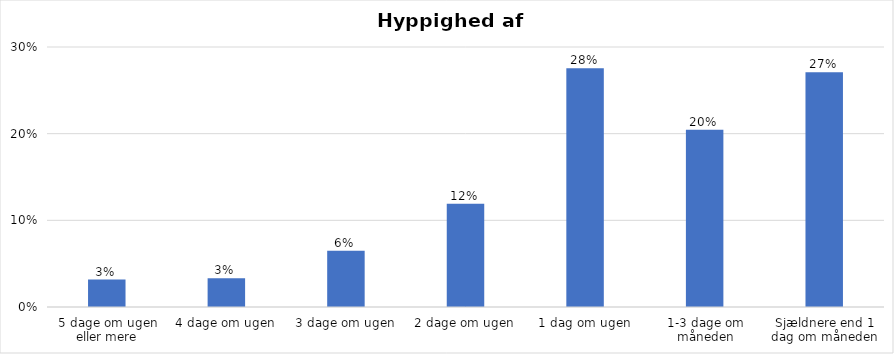
| Category | % |
|---|---|
| 5 dage om ugen eller mere | 0.032 |
| 4 dage om ugen | 0.033 |
| 3 dage om ugen | 0.065 |
| 2 dage om ugen | 0.119 |
| 1 dag om ugen | 0.275 |
| 1-3 dage om måneden | 0.205 |
| Sjældnere end 1 dag om måneden | 0.271 |